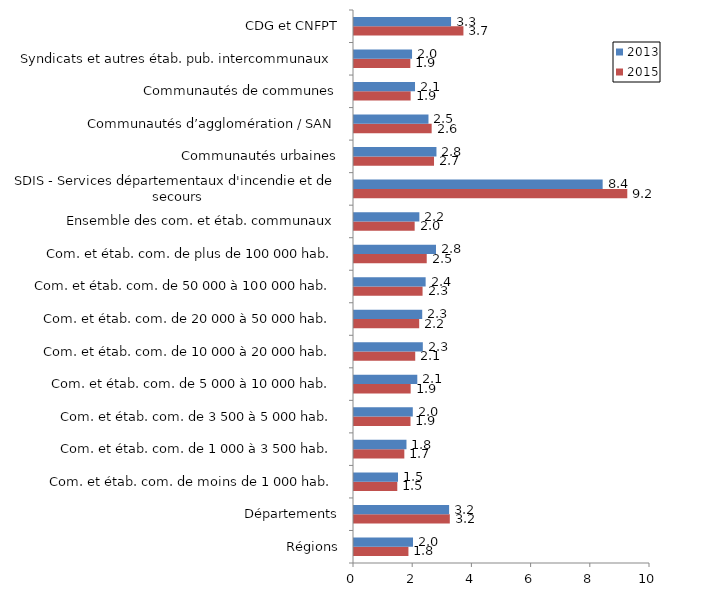
| Category | 2015 | 2013 |
|---|---|---|
| Régions | 1.839 | 1.993 |
| Départements | 3.237 | 3.213 |
| Com. et étab. com. de moins de 1 000 hab. | 1.463 | 1.487 |
| Com. et étab. com. de 1 000 à 3 500 hab. | 1.7 | 1.773 |
| Com. et étab. com. de 3 500 à 5 000 hab. | 1.909 | 1.986 |
| Com. et étab. com. de 5 000 à 10 000 hab. | 1.914 | 2.138 |
| Com. et étab. com. de 10 000 à 20 000 hab. | 2.068 | 2.325 |
| Com. et étab. com. de 20 000 à 50 000 hab. | 2.203 | 2.305 |
| Com. et étab. com. de 50 000 à 100 000 hab. | 2.317 | 2.42 |
| Com. et étab. com. de plus de 100 000 hab. | 2.457 | 2.77 |
| Ensemble des com. et étab. communaux | 2.05 | 2.208 |
| SDIS - Services départementaux d'incendie et de secours | 9.233 | 8.401 |
| Communautés urbaines | 2.703 | 2.786 |
| Communautés d’agglomération / SAN | 2.624 | 2.516 |
| Communautés de communes | 1.913 | 2.061 |
| Syndicats et autres étab. pub. intercommunaux | 1.903 | 1.961 |
| CDG et CNFPT | 3.697 | 3.279 |